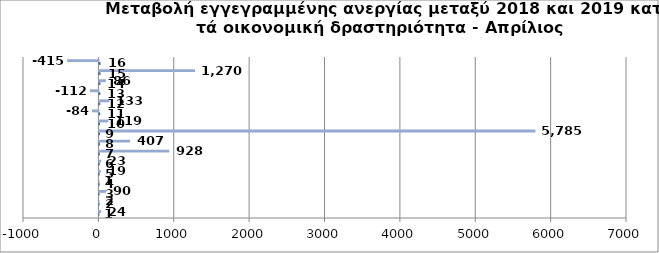
| Category | Series 0 | Series 1 |
|---|---|---|
| 0 | 1 | 24 |
| 1 | 2 | 2 |
| 2 | 3 | 90 |
| 3 | 4 | 1 |
| 4 | 5 | 19 |
| 5 | 6 | 23 |
| 6 | 7 | 928 |
| 7 | 8 | 407 |
| 8 | 9 | 5785 |
| 9 | 10 | 119 |
| 10 | 11 | -84 |
| 11 | 12 | 133 |
| 12 | 13 | -112 |
| 13 | 14 | 86 |
| 14 | 15 | 1270 |
| 15 | 16 | -415 |